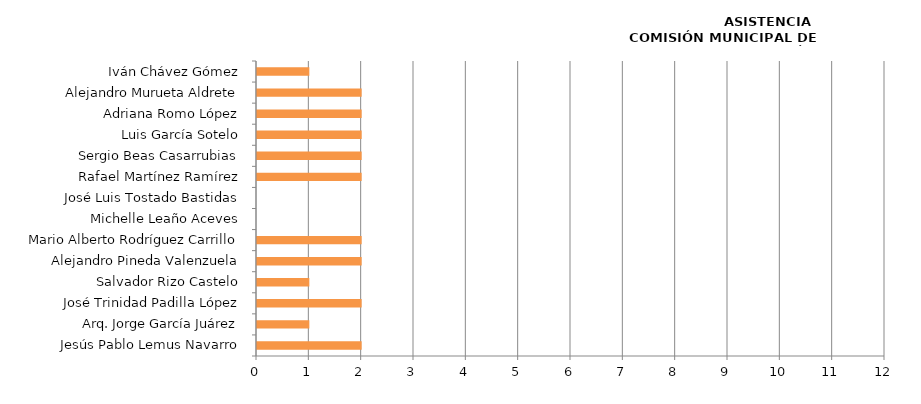
| Category | Series 0 |
|---|---|
| Jesús Pablo Lemus Navarro | 2 |
| Arq. Jorge García Juárez | 1 |
| José Trinidad Padilla López | 2 |
| Salvador Rizo Castelo | 1 |
| Alejandro Pineda Valenzuela | 2 |
| Mario Alberto Rodríguez Carrillo | 2 |
| Michelle Leaño Aceves | 0 |
| José Luis Tostado Bastidas | 0 |
| Rafael Martínez Ramírez | 2 |
| Sergio Beas Casarrubias | 2 |
| Luis García Sotelo | 2 |
| Adriana Romo López | 2 |
| Alejandro Murueta Aldrete | 2 |
| Iván Chávez Gómez | 1 |